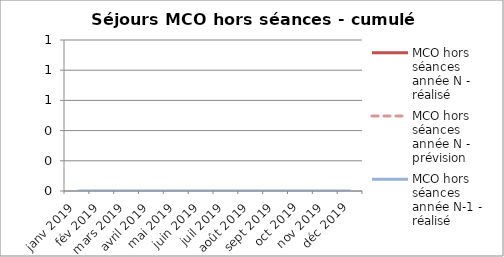
| Category | MCO hors séances année N - réalisé | MCO hors séances année N - prévision | MCO hors séances année N-1 - réalisé |
|---|---|---|---|
| janv 2019 |  |  | 0 |
| fév 2019 |  |  | 0 |
| mars 2019 |  |  | 0 |
| avril 2019 |  |  | 0 |
| mai 2019 |  |  | 0 |
| juin 2019 |  |  | 0 |
| juil 2019 |  |  | 0 |
| août 2019 |  |  | 0 |
| sept 2019 |  |  | 0 |
| oct 2019 |  |  | 0 |
| nov 2019 |  |  | 0 |
| déc 2019 |  |  | 0 |